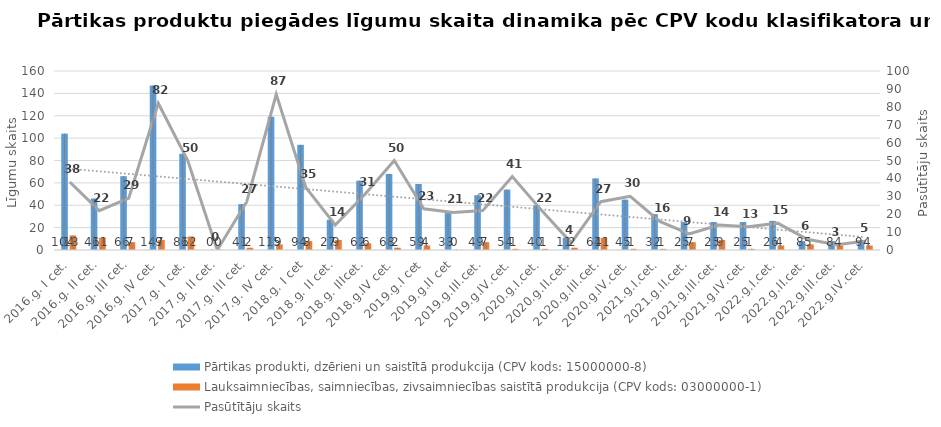
| Category | Pārtikas produkti, dzērieni un saistītā produkcija (CPV kods: 15000000-8) | Lauksaimniecības, saimniecības, zivsaimniecības saistītā produkcija (CPV kods: 03000000-1) |
|---|---|---|
| 2016.g. I cet. | 104 | 13 |
| 2016.g. II cet. | 46 | 11 |
| 2016.g. III cet. | 66 | 7 |
| 2016.g. IV cet. | 147 | 9 |
| 2017.g. I cet. | 86 | 12 |
| 2017.g. II cet. | 0 | 0 |
| 2017.g. III cet. | 41 | 2 |
| 2017.g. IV cet. | 119 | 5 |
| 2018.g. I cet | 94 | 8 |
| 2018.g. II cet. | 27 | 9 |
| 2018.g. IIIcet. | 62 | 6 |
| 2018.g.IV cet. | 68 | 2 |
| 2019.g.I cet | 59 | 4 |
| 2019.g.II cet | 33 | 0 |
| 2019.g.III.cet. | 49 | 7 |
| 2019.g.IV.cet. | 54 | 1 |
| 2020.g.I.cet. | 40 | 1 |
| 2020.g.II.cet. | 11 | 2 |
| 2020.g.III.cet. | 64 | 11 |
| 2020.g.IV.cet. | 45 | 1 |
| 2021.g.I.cet. | 32 | 1 |
| 2021.g.II.cet. | 25 | 7 |
| 2021.g.III.cet. | 25 | 9 |
| 2021.g.IV.cet. | 25 | 1 |
| 2022.g.I.cet. | 26 | 4 |
| 2022.g.II.cet. | 8 | 5 |
| 2022.g.III.cet. | 8 | 4 |
| 2022.g.IV.cet. | 9 | 4 |